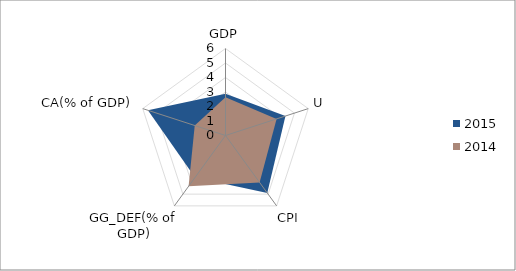
| Category | 2015 | 2014 |
|---|---|---|
| GDP | 2.88 | 2.64 |
| U | 4.348 | 3.704 |
| CPI | 4.9 | 4 |
| GG_DEF(% of GDP) | 3.571 | 4.33 |
| CA(% of GDP) | 5.625 | 2.23 |